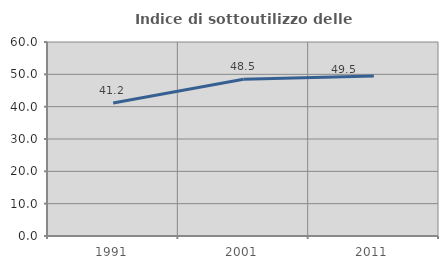
| Category | Indice di sottoutilizzo delle abitazioni  |
|---|---|
| 1991.0 | 41.16 |
| 2001.0 | 48.493 |
| 2011.0 | 49.452 |